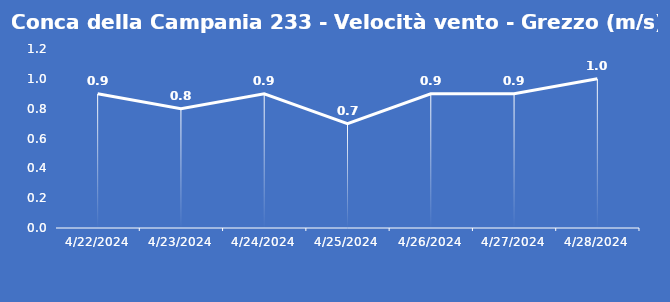
| Category | Conca della Campania 233 - Velocità vento - Grezzo (m/s) |
|---|---|
| 4/22/24 | 0.9 |
| 4/23/24 | 0.8 |
| 4/24/24 | 0.9 |
| 4/25/24 | 0.7 |
| 4/26/24 | 0.9 |
| 4/27/24 | 0.9 |
| 4/28/24 | 1 |